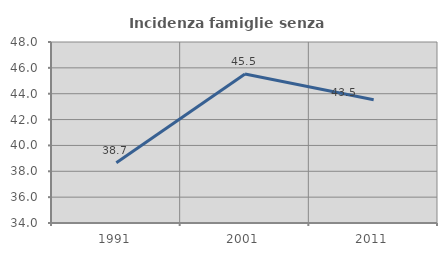
| Category | Incidenza famiglie senza nuclei |
|---|---|
| 1991.0 | 38.655 |
| 2001.0 | 45.519 |
| 2011.0 | 43.539 |